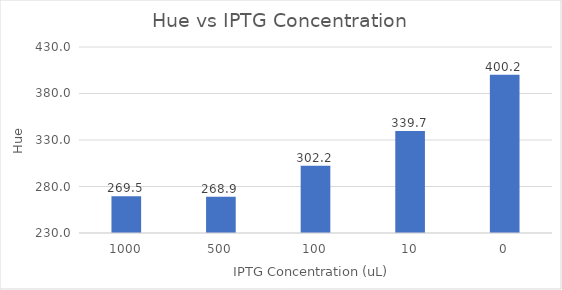
| Category | H |
|---|---|
| 0 | 269.5 |
| 1 | 268.9 |
| 2 | 302.19 |
| 3 | 339.716 |
| 4 | 400.159 |